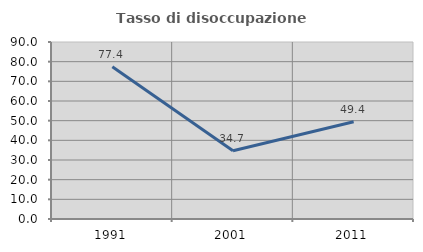
| Category | Tasso di disoccupazione giovanile  |
|---|---|
| 1991.0 | 77.431 |
| 2001.0 | 34.694 |
| 2011.0 | 49.425 |